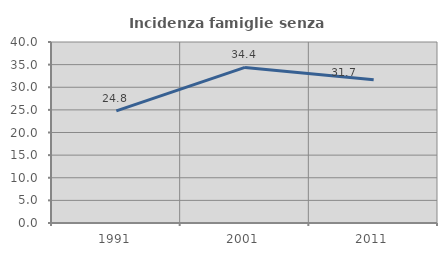
| Category | Incidenza famiglie senza nuclei |
|---|---|
| 1991.0 | 24.786 |
| 2001.0 | 34.375 |
| 2011.0 | 31.667 |